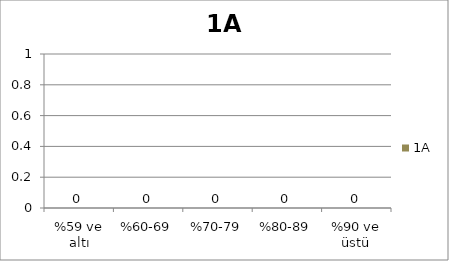
| Category | 1A |
|---|---|
| %59 ve altı | 0 |
| %60-69 | 0 |
| %70-79 | 0 |
| %80-89 | 0 |
| %90 ve üstü | 0 |